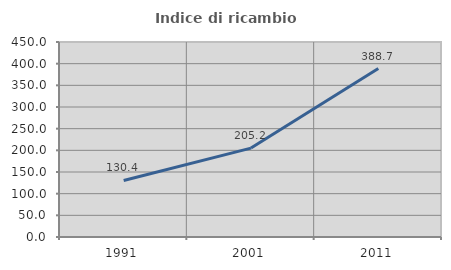
| Category | Indice di ricambio occupazionale  |
|---|---|
| 1991.0 | 130.441 |
| 2001.0 | 205.179 |
| 2011.0 | 388.681 |